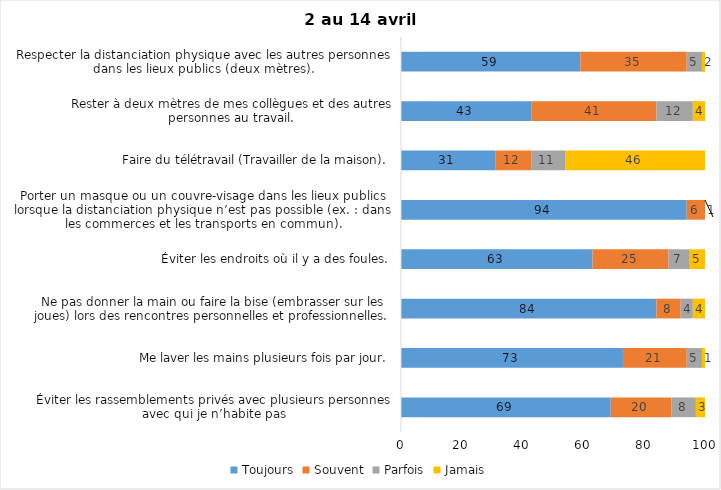
| Category | Toujours | Souvent | Parfois | Jamais |
|---|---|---|---|---|
| Éviter les rassemblements privés avec plusieurs personnes avec qui je n’habite pas | 69 | 20 | 8 | 3 |
| Me laver les mains plusieurs fois par jour. | 73 | 21 | 5 | 1 |
| Ne pas donner la main ou faire la bise (embrasser sur les joues) lors des rencontres personnelles et professionnelles. | 84 | 8 | 4 | 4 |
| Éviter les endroits où il y a des foules. | 63 | 25 | 7 | 5 |
| Porter un masque ou un couvre-visage dans les lieux publics lorsque la distanciation physique n’est pas possible (ex. : dans les commerces et les transports en commun). | 94 | 6 | 0 | 1 |
| Faire du télétravail (Travailler de la maison). | 31 | 12 | 11 | 46 |
| Rester à deux mètres de mes collègues et des autres personnes au travail. | 43 | 41 | 12 | 4 |
| Respecter la distanciation physique avec les autres personnes dans les lieux publics (deux mètres). | 59 | 35 | 5 | 2 |